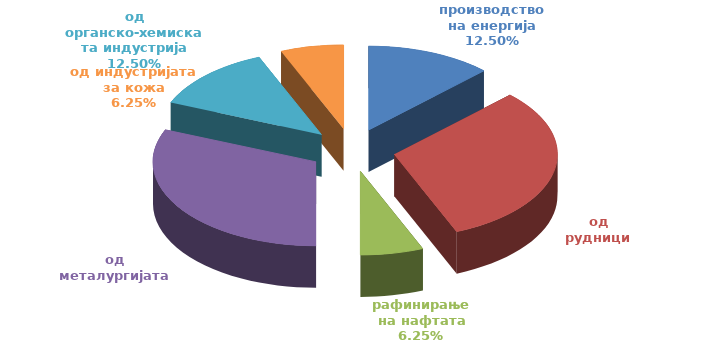
| Category | Series 0 |
|---|---|
| производство на енергија | 0.125 |
| од рудници | 0.312 |
| рафинирање на нафтата | 0.062 |
| од металургијата | 0.312 |
| од органско-хемиската индустрија | 0.125 |
| од индустријата за кожа | 0.062 |